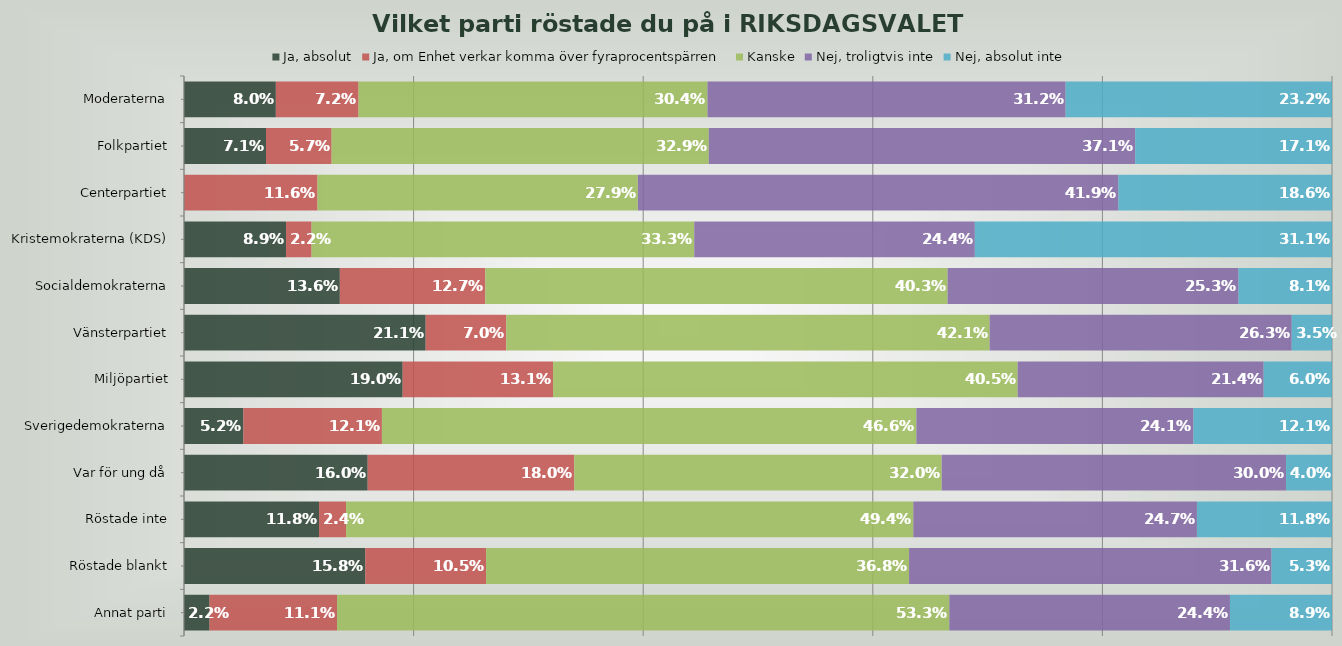
| Category | Ja, absolut | Ja, om Enhet verkar komma över fyraprocentspärren | Kanske | Nej, troligtvis inte | Nej, absolut inte |
|---|---|---|---|---|---|
| Moderaterna | 0.08 | 0.072 | 0.304 | 0.312 | 0.232 |
| Folkpartiet | 0.071 | 0.057 | 0.329 | 0.371 | 0.171 |
| Centerpartiet | 0 | 0.116 | 0.279 | 0.419 | 0.186 |
| Kristemokraterna (KDS) | 0.089 | 0.022 | 0.333 | 0.244 | 0.311 |
| Socialdemokraterna | 0.136 | 0.127 | 0.403 | 0.253 | 0.081 |
| Vänsterpartiet | 0.211 | 0.07 | 0.421 | 0.263 | 0.035 |
| Miljöpartiet | 0.19 | 0.131 | 0.405 | 0.214 | 0.06 |
| Sverigedemokraterna | 0.052 | 0.121 | 0.466 | 0.241 | 0.121 |
| Var för ung då | 0.16 | 0.18 | 0.32 | 0.3 | 0.04 |
| Röstade inte | 0.118 | 0.024 | 0.494 | 0.247 | 0.118 |
| Röstade blankt | 0.158 | 0.105 | 0.368 | 0.316 | 0.053 |
| Annat parti | 0.022 | 0.111 | 0.533 | 0.244 | 0.089 |